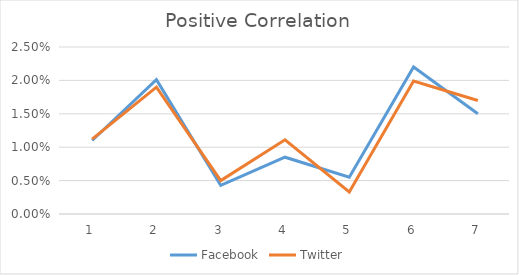
| Category | Facebook | Twitter |
|---|---|---|
| 0 | 0.011 | 0.011 |
| 1 | 0.02 | 0.019 |
| 2 | 0.004 | 0.005 |
| 3 | 0.008 | 0.011 |
| 4 | 0.006 | 0.003 |
| 5 | 0.022 | 0.02 |
| 6 | 0.015 | 0.017 |